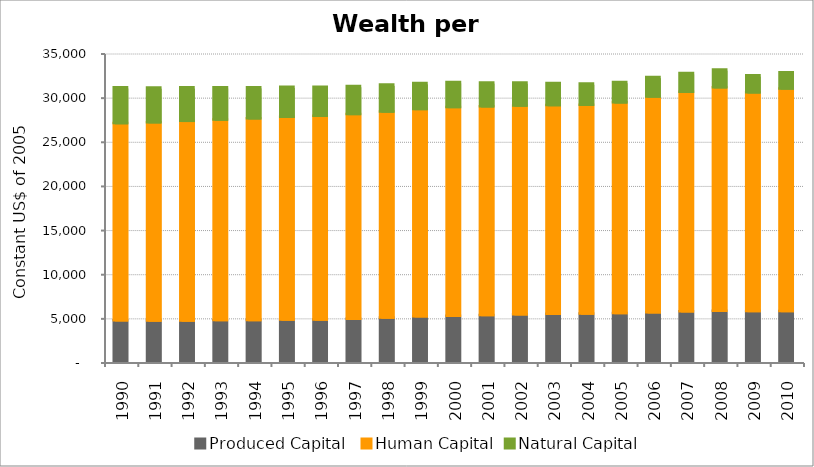
| Category | Produced Capital  | Human Capital | Natural Capital |
|---|---|---|---|
| 1990.0 | 4709.198 | 22323.069 | 4069.45 |
| 1991.0 | 4663.477 | 22474.024 | 3928.174 |
| 1992.0 | 4685.856 | 22602.063 | 3790.609 |
| 1993.0 | 4720.541 | 22719.166 | 3656.446 |
| 1994.0 | 4737.778 | 22841.743 | 3526.369 |
| 1995.0 | 4773.861 | 22976.326 | 3400.502 |
| 1996.0 | 4794.585 | 23071.148 | 3278.188 |
| 1997.0 | 4876.886 | 23197.33 | 3159.178 |
| 1998.0 | 5009.39 | 23342.69 | 3041.28 |
| 1999.0 | 5146.705 | 23491.145 | 2926.163 |
| 2000.0 | 5224.041 | 23635.728 | 2813.971 |
| 2001.0 | 5291.56 | 23644.748 | 2706.129 |
| 2002.0 | 5378.676 | 23643.646 | 2601.412 |
| 2003.0 | 5435.635 | 23639.7 | 2498.532 |
| 2004.0 | 5474.339 | 23644.062 | 2399.58 |
| 2005.0 | 5517.871 | 23864.636 | 2304.887 |
| 2006.0 | 5610.075 | 24443.206 | 2203.545 |
| 2007.0 | 5707.79 | 24882.131 | 2106.652 |
| 2008.0 | 5762.615 | 25338.336 | 2013.224 |
| 2009.0 | 5746.231 | 24768.09 | 1923.143 |
| 2010.0 | 5740.812 | 25221.63 | 1836.076 |